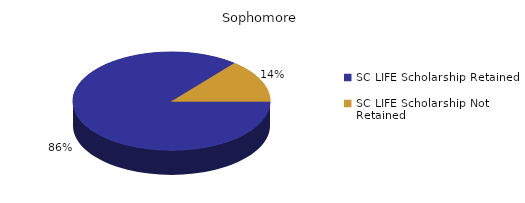
| Category | Sophomore |
|---|---|
| SC LIFE Scholarship Retained  | 1621 |
| SC LIFE Scholarship Not Retained  | 265 |